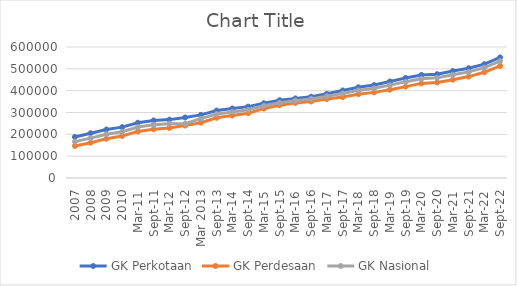
| Category | GK Perkotaan | GK Perdesaan | GK Nasional |
|---|---|---|---|
| 2007 | 187942 | 146837 | 166697 |
| 2008 | 204895.99 | 161830.79 | 182636 |
| 2009 | 222123.1 | 179834.57 | 200262 |
| 2010 | 232989 | 192353.83 | 211726 |
| Mar-11 | 253016 | 213395 | 233740 |
| Sep-11 | 263594 | 223181 | 243729 |
| Mar-12 | 267407.53 | 229225.78 | 248707 |
| Sep-12 | 277382 | 240441 | 248707 |
| Mar 2013 | 289041.91 | 253273.31 | 271626 |
| Sep-13 | 308826 | 275779 | 292951 |
| Mar-14 | 318514 | 286097 | 302735 |
| Sep-14 | 326853 | 296681 | 312328 |
| Mar-15 | 342541 | 317881 | 330776 |
| Sep-15 | 356378 | 333034 | 344809 |
| Mar-16 | 364526.571 | 343646.772 | 354386 |
| Sep-16 | 372114 | 350420 | 361990 |
| Mar-17 | 385621 | 361496 | 374478 |
| Sep-17 | 400995 | 370910 | 387160 |
| Mar-18 | 415614 | 383908 | 401220 |
| Sep-18 | 425770 | 392154 | 410670 |
| Mar-19 | 442062 | 404398 | 425250 |
| Sep-19 | 458380 | 418515 | 440538 |
| Mar-20 | 471882 | 433281 | 454652 |
| Sep-20 | 475477 | 437902 | 458947 |
| Mar-21 | 489848 | 450185 | 472515 |
| Sep-21 | 502730 | 464474 | 486168 |
| Mar-22 | 521494 | 484209 | 505469 |
| Sep-22 | 552349 | 513170 | 535547 |